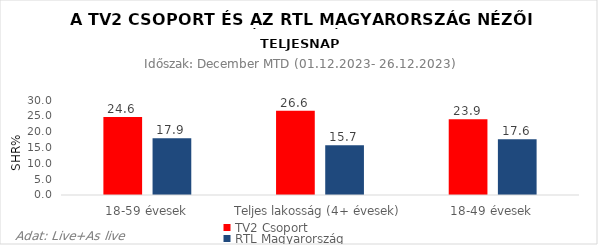
| Category | TV2 Csoport | RTL Magyarország |
|---|---|---|
| 18-59 évesek | 24.6 | 17.9 |
| Teljes lakosság (4+ évesek) | 26.6 | 15.7 |
| 18-49 évesek | 23.9 | 17.6 |